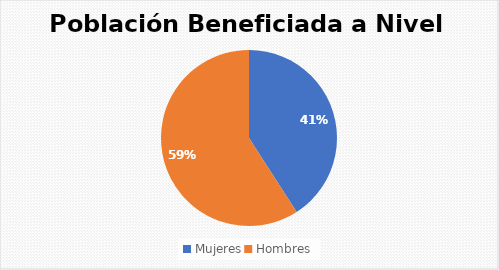
| Category | Series 0 |
|---|---|
| Mujeres | 83 |
| Hombres | 120 |